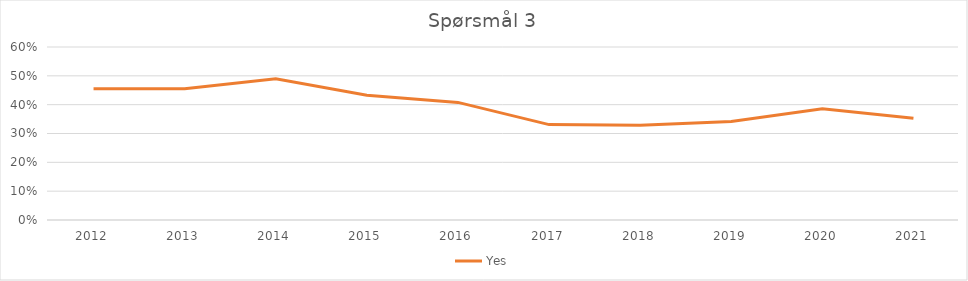
| Category | Yes |
|---|---|
| 2012.0 | 0.455 |
| 2013.0 | 0.455 |
| 2014.0 | 0.49 |
| 2015.0 | 0.433 |
| 2016.0 | 0.408 |
| 2017.0 | 0.331 |
| 2018.0 | 0.329 |
| 2019.0 | 0.341 |
| 2020.0 | 0.386 |
| 2021.0 | 0.353 |